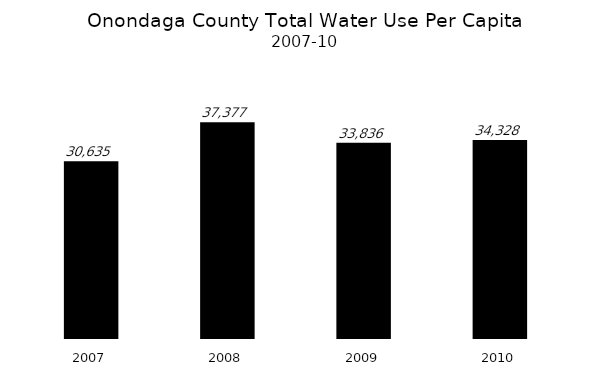
| Category | Series 0 |
|---|---|
| 2007.0 | 30634.953 |
| 2008.0 | 37376.796 |
| 2009.0 | 33835.789 |
| 2010.0 | 34327.994 |